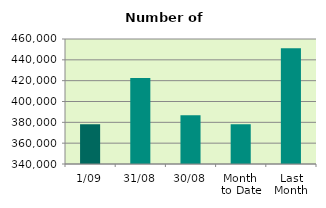
| Category | Series 0 |
|---|---|
| 1/09 | 378162 |
| 31/08 | 422444 |
| 30/08 | 386862 |
| Month 
to Date | 378162 |
| Last
Month | 451097.913 |